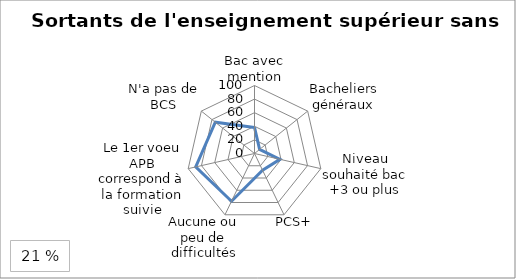
| Category | Sortants de l'enseignement supérieur sans diplôme |
|---|---|
| Bac avec mention | 38.3 |
| Bacheliers généraux | 9.6 |
| Niveau souhaité bac +3 ou plus | 38.4 |
| PCS+ | 27.4 |
| Aucune ou peu de difficultés | 77.9 |
| Le 1er voeu APB correspond à la formation suivie | 88.7 |
| N'a pas de BCS | 73.7 |